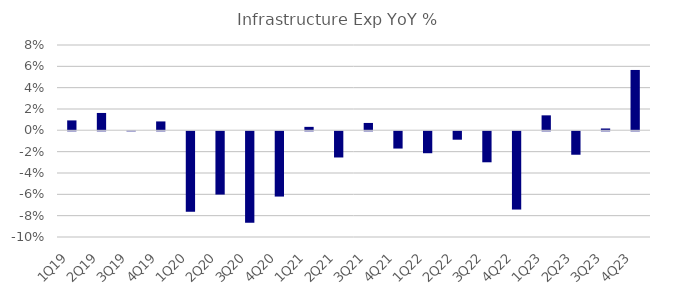
| Category | Infrastructure Exp YoY % |
|---|---|
| 1Q19 | 0.009 |
| 2Q19 | 0.016 |
| 3Q19 | 0 |
| 4Q19 | 0.008 |
| 1Q20 | -0.075 |
| 2Q20 | -0.059 |
| 3Q20 | -0.086 |
| 4Q20 | -0.061 |
| 1Q21 | 0.003 |
| 2Q21 | -0.025 |
| 3Q21 | 0.007 |
| 4Q21 | -0.016 |
| 1Q22 | -0.021 |
| 2Q22 | -0.008 |
| 3Q22 | -0.029 |
| 4Q22 | -0.073 |
| 1Q23 | 0.014 |
| 2Q23 | -0.022 |
| 3Q23 | 0.002 |
| 4Q23 | 0.057 |